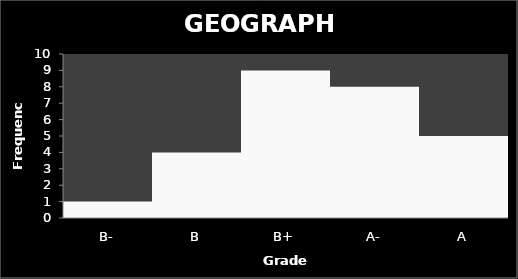
| Category | Series 0 |
|---|---|
| B- | 1 |
| B | 4 |
| B+ | 9 |
| A- | 8 |
| A | 5 |